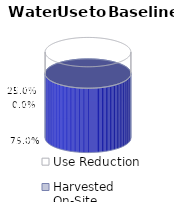
| Category | Net Utility | Harvested On-Site | Use Reduction |
|---|---|---|---|
| 0 | 0.75 | 0 | 0.25 |